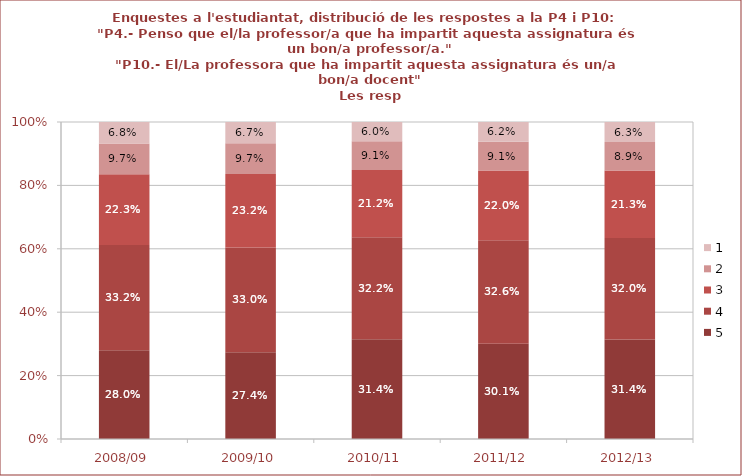
| Category | 5 | 4 | 3 | 2 | 1 |
|---|---|---|---|---|---|
| 2008/09 | 0.28 | 0.332 | 0.223 | 0.097 | 0.068 |
| 2009/10 | 0.274 | 0.33 | 0.232 | 0.097 | 0.067 |
| 2010/11 | 0.314 | 0.322 | 0.212 | 0.091 | 0.06 |
| 2011/12 | 0.301 | 0.326 | 0.22 | 0.091 | 0.062 |
| 2012/13 | 0.314 | 0.32 | 0.213 | 0.089 | 0.063 |